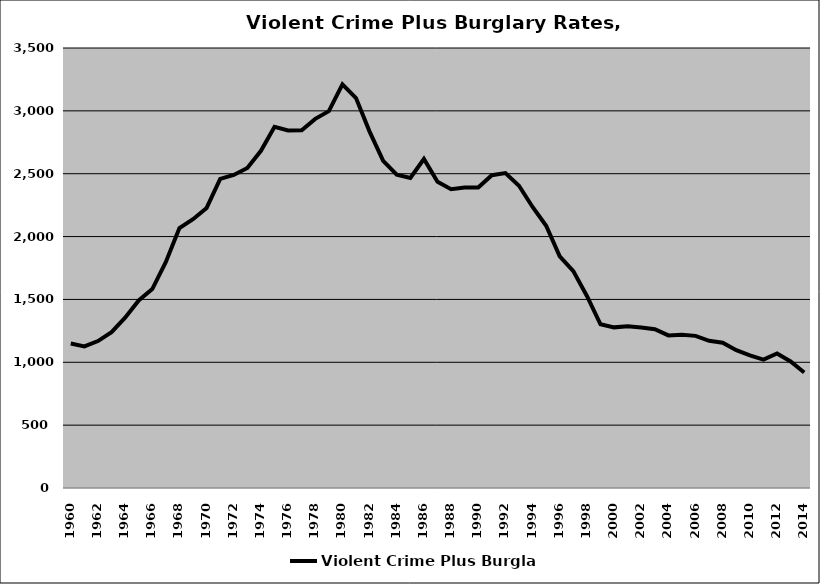
| Category | Violent Crime Plus Burglary |
|---|---|
| 1960.0 | 1149.441 |
| 1961.0 | 1126.846 |
| 1962.0 | 1168.939 |
| 1963.0 | 1240.034 |
| 1964.0 | 1354.286 |
| 1965.0 | 1491.759 |
| 1966.0 | 1582.535 |
| 1967.0 | 1798.173 |
| 1968.0 | 2067.395 |
| 1969.0 | 2138.399 |
| 1970.0 | 2227.866 |
| 1971.0 | 2458.335 |
| 1972.0 | 2489.872 |
| 1973.0 | 2545.444 |
| 1974.0 | 2682.604 |
| 1975.0 | 2872.636 |
| 1976.0 | 2843.964 |
| 1977.0 | 2845.424 |
| 1978.0 | 2936.18 |
| 1979.0 | 2997.872 |
| 1980.0 | 3210.123 |
| 1981.0 | 3101.498 |
| 1982.0 | 2834.877 |
| 1983.0 | 2601.696 |
| 1984.0 | 2492.713 |
| 1985.0 | 2466.41 |
| 1986.0 | 2616.908 |
| 1987.0 | 2436.149 |
| 1988.0 | 2376.963 |
| 1989.0 | 2389.994 |
| 1990.0 | 2390.6 |
| 1991.0 | 2487.749 |
| 1992.0 | 2504.665 |
| 1993.0 | 2404.803 |
| 1994.0 | 2235.538 |
| 1995.0 | 2086.324 |
| 1996.0 | 1842.048 |
| 1997.0 | 1725.617 |
| 1998.0 | 1527.214 |
| 1999.0 | 1302.433 |
| 2000.0 | 1277.836 |
| 2001.0 | 1286.515 |
| 2002.0 | 1276.545 |
| 2003.0 | 1262.805 |
| 2004.0 | 1213.876 |
| 2005.0 | 1218.945 |
| 2006.0 | 1210.166 |
| 2007.0 | 1171.008 |
| 2008.0 | 1156.076 |
| 2009.0 | 1096.087 |
| 2010.0 | 1054.895 |
| 2011.0 | 1021.703 |
| 2012.0 | 1070.296 |
| 2013.0 | 1006.461 |
| 2014.0 | 918.443 |